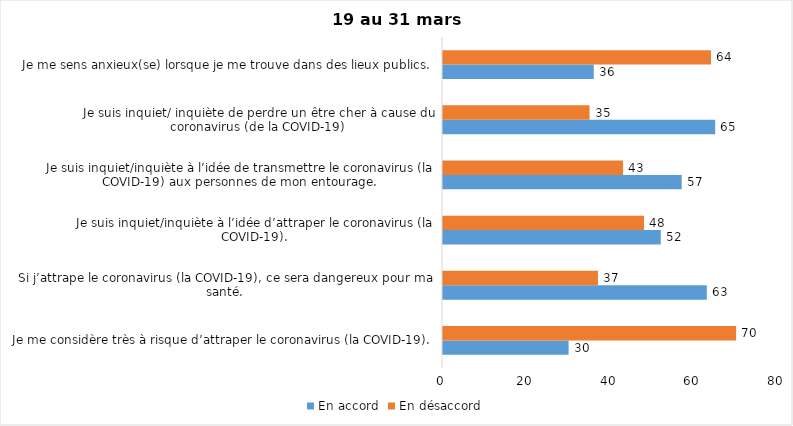
| Category | En accord | En désaccord |
|---|---|---|
| Je me considère très à risque d’attraper le coronavirus (la COVID-19). | 30 | 70 |
| Si j’attrape le coronavirus (la COVID-19), ce sera dangereux pour ma santé. | 63 | 37 |
| Je suis inquiet/inquiète à l’idée d’attraper le coronavirus (la COVID-19). | 52 | 48 |
| Je suis inquiet/inquiète à l’idée de transmettre le coronavirus (la COVID-19) aux personnes de mon entourage. | 57 | 43 |
| Je suis inquiet/ inquiète de perdre un être cher à cause du coronavirus (de la COVID-19) | 65 | 35 |
| Je me sens anxieux(se) lorsque je me trouve dans des lieux publics. | 36 | 64 |